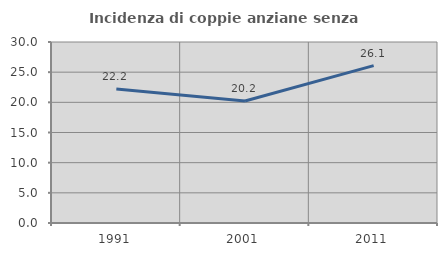
| Category | Incidenza di coppie anziane senza figli  |
|---|---|
| 1991.0 | 22.222 |
| 2001.0 | 20.225 |
| 2011.0 | 26.087 |